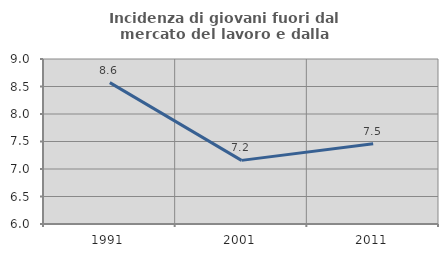
| Category | Incidenza di giovani fuori dal mercato del lavoro e dalla formazione  |
|---|---|
| 1991.0 | 8.57 |
| 2001.0 | 7.157 |
| 2011.0 | 7.461 |